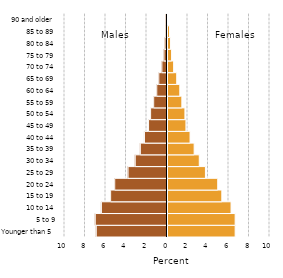
| Category | Female |
|---|---|
| Younger than 5 | 6.6 |
| 5 to 9 | 6.6 |
| 10 to 14 | 6.2 |
| 15 to 19 | 5.3 |
| 20 to 24 | 4.9 |
| 25 to 29 | 3.7 |
| 30 to 34 | 3.1 |
| 35 to 39 | 2.6 |
| 40 to 44 | 2.2 |
| 45 to 49 | 1.8 |
| 50 to 54 | 1.7 |
| 55 to 59 | 1.4 |
| 60 to 64 | 1.2 |
| 65 to 69 | 0.9 |
| 70 to 74 | 0.6 |
| 75 to 79 | 0.4 |
| 80 to 84 | 0.3 |
| 85 to 89 | 0.2 |
| 90 and older | 0.1 |